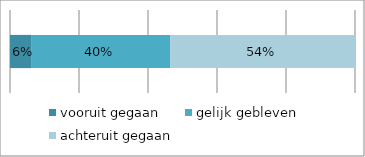
| Category | vooruit gegaan | gelijk gebleven | achteruit gegaan |
|---|---|---|---|
| 0 | 0.063 | 0.401 | 0.536 |